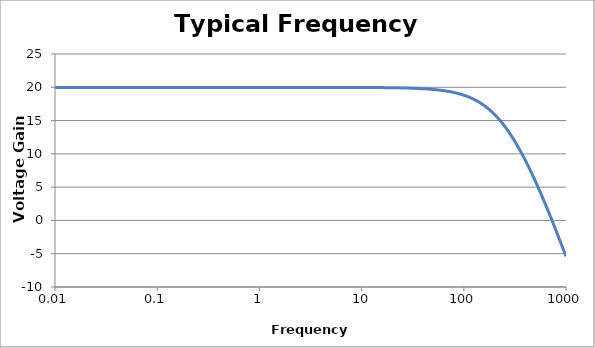
| Category | Voltage Gain (dB) |
|---|---|
| 0.01 | 19.982 |
| 0.011220184543019601 | 19.982 |
| 0.0125892541179417 | 19.982 |
| 0.0141253754462275 | 19.982 |
| 0.0158489319246111 | 19.982 |
| 0.0177827941003892 | 19.982 |
| 0.019952623149688802 | 19.982 |
| 0.0223872113856834 | 19.982 |
| 0.025118864315095798 | 19.982 |
| 0.0281838293126445 | 19.982 |
| 0.0316227766016838 | 19.982 |
| 0.035481338923357496 | 19.982 |
| 0.0398107170553497 | 19.982 |
| 0.0446683592150963 | 19.982 |
| 0.0501187233627272 | 19.982 |
| 0.0562341325190348 | 19.982 |
| 0.0630957344480192 | 19.982 |
| 0.07079457843841369 | 19.982 |
| 0.079432823472428 | 19.982 |
| 0.08912509381337441 | 19.982 |
| 0.0999999999999998 | 19.982 |
| 0.112201845430196 | 19.982 |
| 0.125892541179417 | 19.982 |
| 0.141253754462275 | 19.982 |
| 0.15848931924611098 | 19.982 |
| 0.177827941003892 | 19.982 |
| 0.199526231496888 | 19.982 |
| 0.223872113856833 | 19.982 |
| 0.251188643150957 | 19.982 |
| 0.28183829312644504 | 19.982 |
| 0.316227766016837 | 19.982 |
| 0.35481338923357497 | 19.982 |
| 0.39810717055349604 | 19.982 |
| 0.446683592150962 | 19.982 |
| 0.501187233627271 | 19.982 |
| 0.562341325190348 | 19.982 |
| 0.630957344480192 | 19.982 |
| 0.707945784384136 | 19.982 |
| 0.794328234724279 | 19.982 |
| 0.891250938133743 | 19.982 |
| 0.999999999999997 | 19.982 |
| 1.12201845430196 | 19.982 |
| 1.25892541179416 | 19.981 |
| 1.41253754462275 | 19.981 |
| 1.58489319246111 | 19.981 |
| 1.77827941003892 | 19.981 |
| 1.99526231496887 | 19.981 |
| 2.23872113856833 | 19.981 |
| 2.51188643150957 | 19.981 |
| 2.81838293126444 | 19.981 |
| 3.1622776601683698 | 19.98 |
| 3.54813389233574 | 19.98 |
| 3.9810717055349603 | 19.98 |
| 4.46683592150961 | 19.979 |
| 5.0118723362727 | 19.979 |
| 5.62341325190347 | 19.978 |
| 6.3095734448019005 | 19.977 |
| 7.07945784384135 | 19.976 |
| 7.94328234724278 | 19.974 |
| 8.91250938133741 | 19.972 |
| 9.99999999999995 | 19.969 |
| 11.2201845430196 | 19.966 |
| 12.5892541179416 | 19.962 |
| 14.1253754462275 | 19.957 |
| 15.848931924611101 | 19.951 |
| 17.7827941003891 | 19.943 |
| 19.9526231496887 | 19.933 |
| 22.387211385683297 | 19.92 |
| 25.1188643150957 | 19.904 |
| 28.183829312644402 | 19.885 |
| 31.6227766016836 | 19.859 |
| 35.481338923357306 | 19.828 |
| 39.8107170553495 | 19.789 |
| 44.668359215096004 | 19.739 |
| 50.118723362726904 | 19.677 |
| 56.2341325190346 | 19.599 |
| 63.095734448018895 | 19.502 |
| 70.7945784384133 | 19.382 |
| 79.4328234724276 | 19.231 |
| 89.125093813374 | 19.044 |
| 99.9999999999993 | 18.814 |
| 112.201845430196 | 18.53 |
| 125.892541179416 | 18.183 |
| 141.253754462274 | 17.761 |
| 158.48931924611 | 17.254 |
| 177.827941003891 | 16.648 |
| 199.526231496887 | 15.934 |
| 223.87211385683202 | 15.103 |
| 251.18864315095598 | 14.149 |
| 281.838293126443 | 13.068 |
| 316.227766016835 | 11.861 |
| 354.813389233573 | 10.534 |
| 398.10717055349403 | 9.092 |
| 446.68359215096 | 7.545 |
| 501.187233627268 | 5.902 |
| 562.341325190344 | 4.174 |
| 630.957344480188 | 2.37 |
| 707.945784384132 | 0.5 |
| 794.3282347242749 | -1.426 |
| 891.250938133738 | -3.397 |
| 1000.0 | -5.397 |